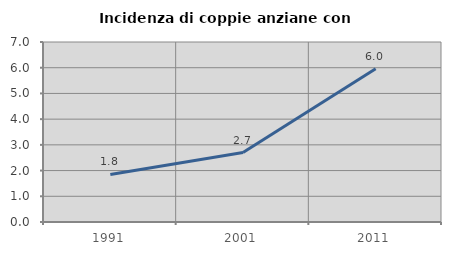
| Category | Incidenza di coppie anziane con figli |
|---|---|
| 1991.0 | 1.848 |
| 2001.0 | 2.703 |
| 2011.0 | 5.959 |